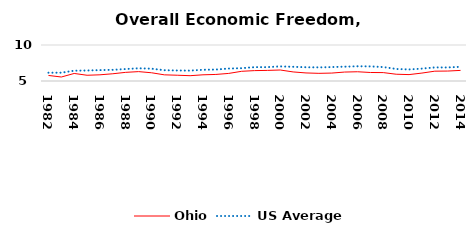
| Category | Ohio | US Average |
|---|---|---|
| 1982.0 | 5.771 | 6.149 |
| 1983.0 | 5.555 | 6.152 |
| 1984.0 | 6.046 | 6.429 |
| 1985.0 | 5.797 | 6.464 |
| 1986.0 | 5.86 | 6.512 |
| 1987.0 | 6.006 | 6.552 |
| 1988.0 | 6.2 | 6.659 |
| 1989.0 | 6.304 | 6.767 |
| 1990.0 | 6.146 | 6.71 |
| 1991.0 | 5.856 | 6.502 |
| 1992.0 | 5.803 | 6.463 |
| 1993.0 | 5.737 | 6.446 |
| 1994.0 | 5.861 | 6.563 |
| 1995.0 | 5.911 | 6.593 |
| 1996.0 | 6.054 | 6.73 |
| 1997.0 | 6.346 | 6.781 |
| 1998.0 | 6.442 | 6.926 |
| 1999.0 | 6.473 | 6.925 |
| 2000.0 | 6.527 | 7.031 |
| 2001.0 | 6.26 | 6.969 |
| 2002.0 | 6.118 | 6.912 |
| 2003.0 | 6.064 | 6.892 |
| 2004.0 | 6.102 | 6.934 |
| 2005.0 | 6.241 | 6.99 |
| 2006.0 | 6.283 | 7.048 |
| 2007.0 | 6.182 | 7.028 |
| 2008.0 | 6.167 | 6.935 |
| 2009.0 | 5.94 | 6.668 |
| 2010.0 | 5.889 | 6.605 |
| 2011.0 | 6.101 | 6.72 |
| 2012.0 | 6.364 | 6.883 |
| 2013.0 | 6.382 | 6.881 |
| 2014.0 | 6.471 | 6.973 |